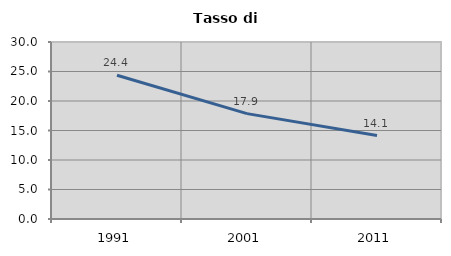
| Category | Tasso di disoccupazione   |
|---|---|
| 1991.0 | 24.359 |
| 2001.0 | 17.857 |
| 2011.0 | 14.139 |